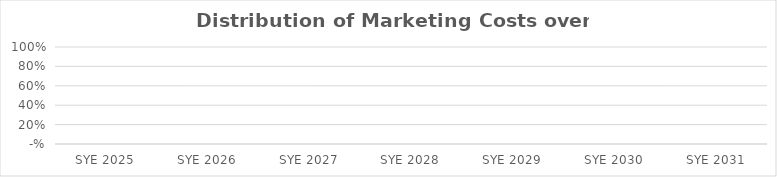
| Category | Series 0 |
|---|---|
| 2025.0 | 0 |
| 2026.0 | 0 |
| 2027.0 | 0 |
| 2028.0 | 0 |
| 2029.0 | 0 |
| 2030.0 | 0 |
| 2031.0 | 0 |